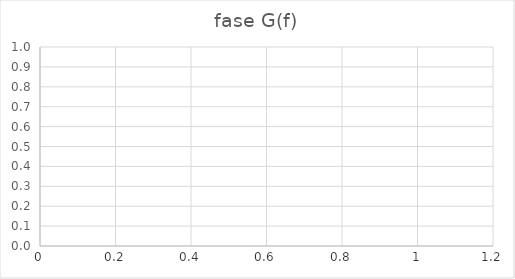
| Category | fase G(f) |
|---|---|
|  | 0 |
|  | 0 |
|  | 0 |
|  | 0 |
|  | 0 |
|  | 0 |
|  | 0 |
|  | 0 |
|  | 0 |
|  | 0 |
|  | 0 |
|  | 0 |
|  | 0 |
|  | 0 |
|  | 0 |
|  | 0 |